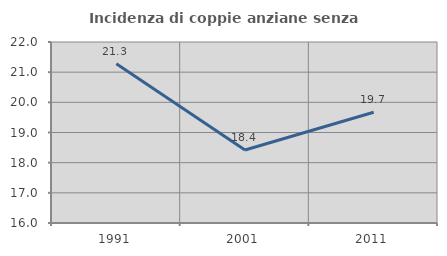
| Category | Incidenza di coppie anziane senza figli  |
|---|---|
| 1991.0 | 21.277 |
| 2001.0 | 18.421 |
| 2011.0 | 19.672 |